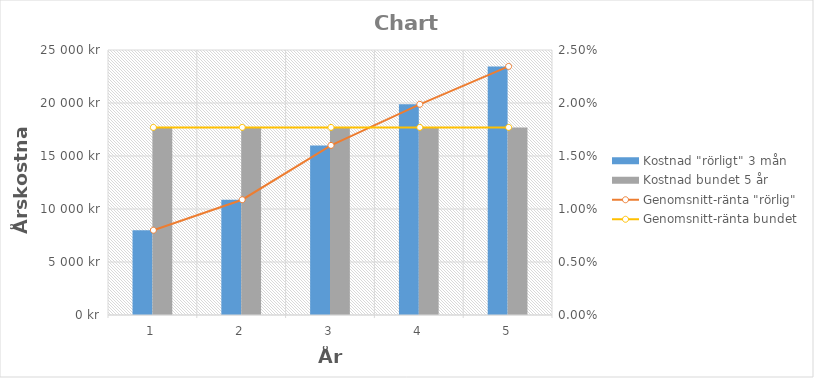
| Category | Kostnad "rörligt" 3 mån | Kostnad bundet 5 år |
|---|---|---|
| 1 | 8000 | 17700 |
| 2 | 10875 | 17700 |
| 3 | 16000 | 17700 |
| 4 | 19875 | 17700 |
| 5 | 23450 | 17700 |